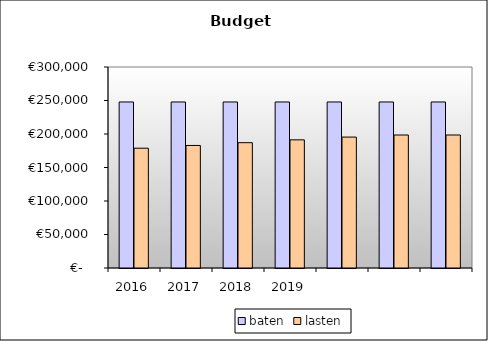
| Category | baten | lasten |
|---|---|---|
| 2016.0 | 247794.489 | 178797.998 |
| 2017.0 | 247794.489 | 182884.914 |
| 2018.0 | 247794.489 | 187036.722 |
| 2019.0 | 247794.489 | 191273.311 |